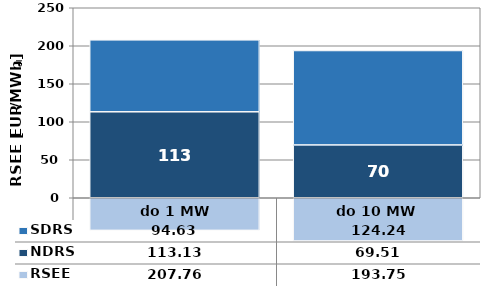
| Category | NDRS | SDRS |
|---|---|---|
|  do 1 MW | 113.13 | 94.63 |
| do 10 MW | 69.51 | 124.24 |